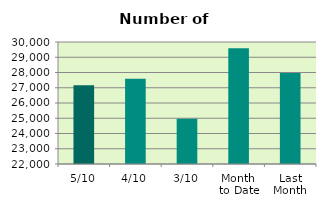
| Category | Series 0 |
|---|---|
| 5/10 | 27160 |
| 4/10 | 27592 |
| 3/10 | 24968 |
| Month 
to Date | 29589.2 |
| Last
Month | 27963.2 |